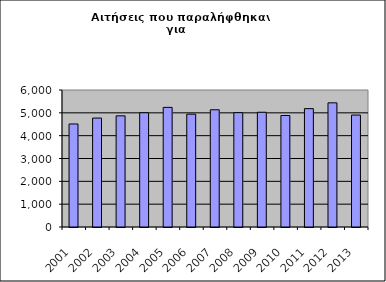
| Category | Series 1 |
|---|---|
| 2001.0 | 4512 |
| 2002.0 | 4771 |
| 2003.0 | 4868 |
| 2004.0 | 5004 |
| 2005.0 | 5239 |
| 2006.0 | 4941 |
| 2007.0 | 5134 |
| 2008.0 | 5007 |
| 2009.0 | 5025 |
| 2010.0 | 4883 |
| 2011.0 | 5184 |
| 2012.0 | 5438 |
| 2013.0 | 4902 |